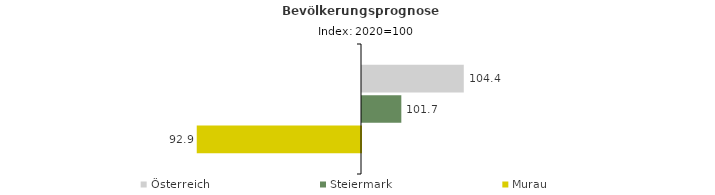
| Category | Österreich | Steiermark | Murau |
|---|---|---|---|
| 2020.0 | 104.4 | 101.7 | 92.9 |